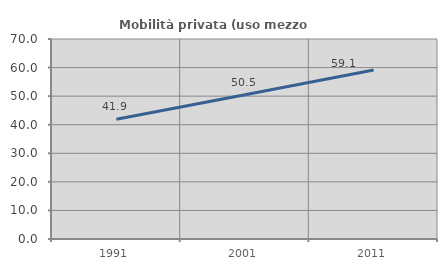
| Category | Mobilità privata (uso mezzo privato) |
|---|---|
| 1991.0 | 41.929 |
| 2001.0 | 50.511 |
| 2011.0 | 59.116 |